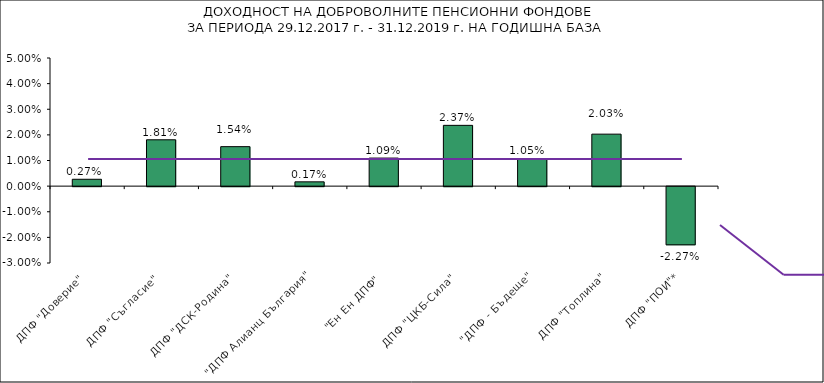
| Category | Series 0 |
|---|---|
| ДПФ "Доверие"  | 0.003 |
| ДПФ "Съгласие"  | 0.018 |
| ДПФ "ДСК-Родина"  | 0.015 |
| "ДПФ Алианц България"  | 0.002 |
| "Ен Ен ДПФ"  | 0.011 |
| ДПФ "ЦКБ-Сила"  | 0.024 |
| "ДПФ - Бъдеще" | 0.011 |
| ДПФ "Топлина" | 0.02 |
| ДПФ "ПОИ"* | -0.023 |